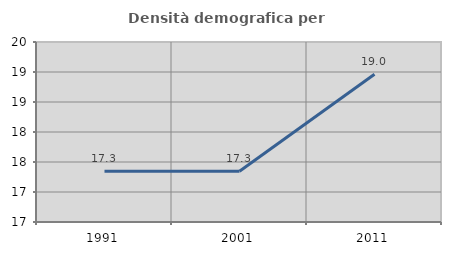
| Category | Densità demografica |
|---|---|
| 1991.0 | 17.346 |
| 2001.0 | 17.346 |
| 2011.0 | 18.961 |